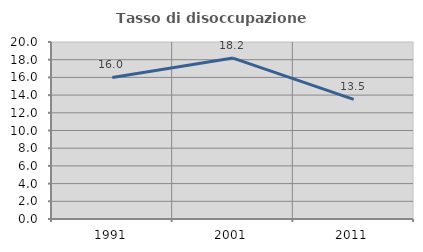
| Category | Tasso di disoccupazione giovanile  |
|---|---|
| 1991.0 | 16 |
| 2001.0 | 18.182 |
| 2011.0 | 13.514 |